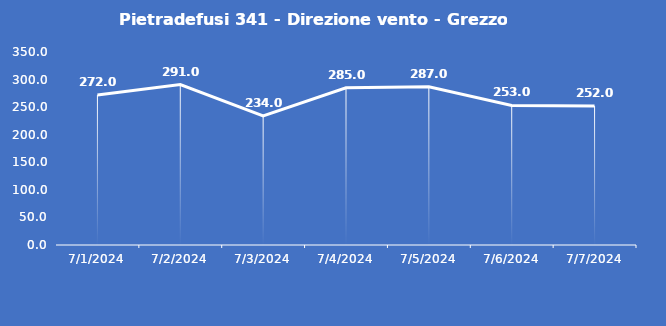
| Category | Pietradefusi 341 - Direzione vento - Grezzo (°N) |
|---|---|
| 7/1/24 | 272 |
| 7/2/24 | 291 |
| 7/3/24 | 234 |
| 7/4/24 | 285 |
| 7/5/24 | 287 |
| 7/6/24 | 253 |
| 7/7/24 | 252 |